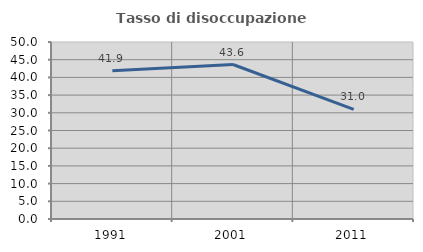
| Category | Tasso di disoccupazione giovanile  |
|---|---|
| 1991.0 | 41.86 |
| 2001.0 | 43.636 |
| 2011.0 | 30.952 |